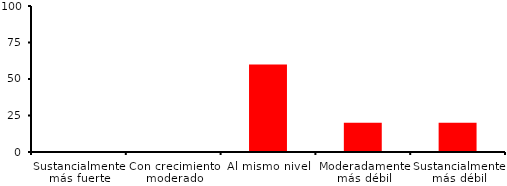
| Category | Series 0 |
|---|---|
| Sustancialmente más fuerte | 0 |
| Con crecimiento moderado | 0 |
| Al mismo nivel | 60 |
| Moderadamente más débil | 20 |
| Sustancialmente más débil | 20 |